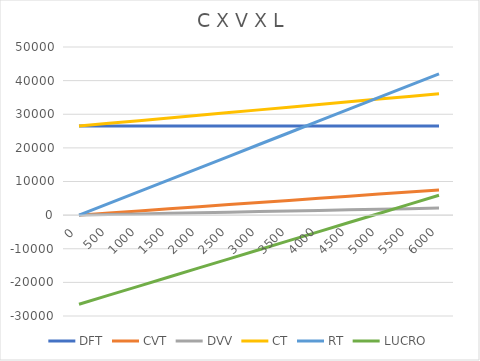
| Category | DFT | CVT | DVV | CT | RT | LUCRO |
|---|---|---|---|---|---|---|
| 0.0 | 26500 | 0 | 0 | 26500 | 0 | -26500 |
| 500.0 | 26500 | 625 | 175 | 27300 | 3500 | -23800 |
| 1000.0 | 26500 | 1250 | 350 | 28100 | 7000 | -21100 |
| 1500.0 | 26500 | 1875 | 525 | 28900 | 10500 | -18400 |
| 2000.0 | 26500 | 2500 | 700 | 29700 | 14000 | -15700 |
| 2500.0 | 26500 | 3125 | 875 | 30500 | 17500 | -13000 |
| 3000.0 | 26500 | 3750 | 1050 | 31300 | 21000 | -10300 |
| 3500.0 | 26500 | 4375 | 1225 | 32100 | 24500 | -7600 |
| 4000.0 | 26500 | 5000 | 1400 | 32900 | 28000 | -4900 |
| 4500.0 | 26500 | 5625 | 1575 | 33700 | 31500 | -2200 |
| 5000.0 | 26500 | 6250 | 1750 | 34500 | 35000 | 500 |
| 5500.0 | 26500 | 6875 | 1925 | 35300 | 38500 | 3200 |
| 6000.0 | 26500 | 7500 | 2100 | 36100 | 42000 | 5900 |